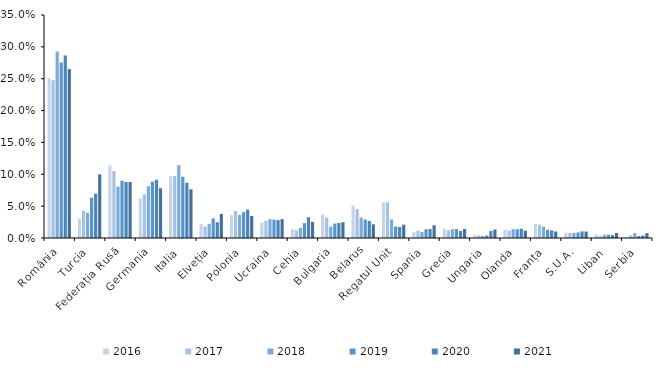
| Category | 2016 | 2017 | 2018 | 2019 | 2020 | 2021 |
|---|---|---|---|---|---|---|
| România | 25.093 | 24.768 | 29.271 | 27.541 | 28.644 | 26.506 |
| Turcia | 3.007 | 4.291 | 3.959 | 6.316 | 6.959 | 9.985 |
| Federația Rusă | 11.405 | 10.496 | 8.077 | 8.99 | 8.789 | 8.78 |
| Germania | 6.193 | 6.851 | 8.126 | 8.85 | 9.144 | 7.806 |
| Italia | 9.675 | 9.733 | 11.441 | 9.609 | 8.663 | 7.634 |
| Elveția | 2.176 | 1.817 | 2.221 | 3.072 | 2.489 | 3.78 |
| Polonia | 3.59 | 4.244 | 3.623 | 4.067 | 4.449 | 3.451 |
| Ucraina | 2.431 | 2.702 | 2.966 | 2.884 | 2.816 | 2.95 |
| Cehia | 1.383 | 1.232 | 1.579 | 2.332 | 3.261 | 2.512 |
| Bulgaria | 3.718 | 3.222 | 1.789 | 2.265 | 2.357 | 2.473 |
| Belarus | 5.064 | 4.536 | 3.224 | 2.894 | 2.67 | 2.157 |
| Regatul Unit  | 5.591 | 5.614 | 2.913 | 1.797 | 1.733 | 2.079 |
| Spania | 0.919 | 1.152 | 0.944 | 1.373 | 1.405 | 1.997 |
| Grecia | 1.443 | 1.216 | 1.384 | 1.413 | 1.096 | 1.415 |
| Ungaria | 0.451 | 0.409 | 0.304 | 0.401 | 1.105 | 1.329 |
| Olanda | 1.316 | 1.149 | 1.386 | 1.363 | 1.458 | 1.139 |
| Franța | 2.189 | 2.096 | 1.787 | 1.296 | 1.201 | 1.031 |
| S.U.A. | 0.832 | 0.776 | 0.804 | 0.876 | 1.041 | 1.009 |
| Liban | 0.55 | 0.329 | 0.516 | 0.517 | 0.471 | 0.79 |
| Serbia | 0.181 | 0.451 | 0.77 | 0.31 | 0.387 | 0.765 |